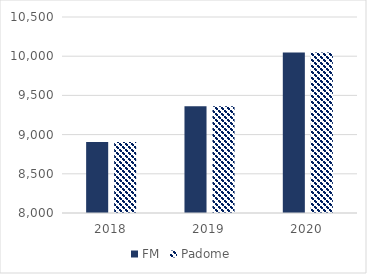
| Category | FM | Padome |
|---|---|---|
| 2018.0 | 8906.843 | 8906.843 |
| 2019.0 | 9360.692 | 9360.692 |
| 2020.0 | 10047.953 | 10047.953 |